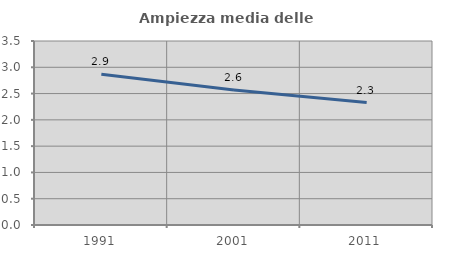
| Category | Ampiezza media delle famiglie |
|---|---|
| 1991.0 | 2.868 |
| 2001.0 | 2.566 |
| 2011.0 | 2.328 |